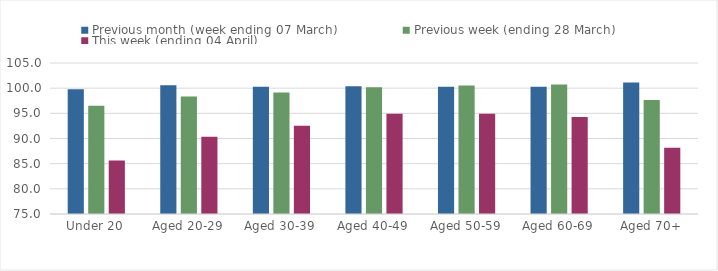
| Category | Previous month (week ending 07 March) | Previous week (ending 28 March) | This week (ending 04 April) |
|---|---|---|---|
| Under 20 | 99.792 | 96.527 | 85.62 |
| Aged 20-29 | 100.592 | 98.346 | 90.349 |
| Aged 30-39 | 100.274 | 99.132 | 92.54 |
| Aged 40-49 | 100.405 | 100.159 | 94.902 |
| Aged 50-59 | 100.284 | 100.538 | 94.928 |
| Aged 60-69 | 100.275 | 100.712 | 94.291 |
| Aged 70+ | 101.103 | 97.641 | 88.158 |